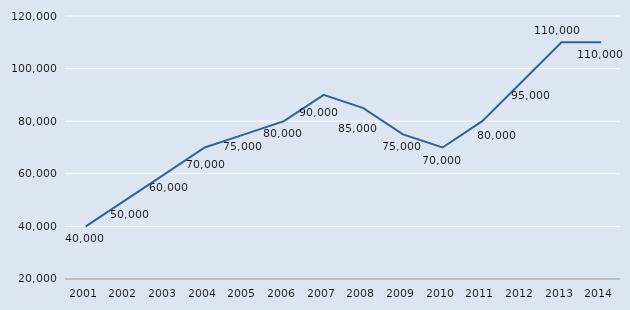
| Category | Series 1 |
|---|---|
| 2001.0 | 40000 |
| 2002.0 | 50000 |
| 2003.0 | 60000 |
| 2004.0 | 70000 |
| 2005.0 | 75000 |
| 2006.0 | 80000 |
| 2007.0 | 90000 |
| 2008.0 | 85000 |
| 2009.0 | 75000 |
| 2010.0 | 70000 |
| 2011.0 | 80000 |
| 2012.0 | 95000 |
| 2013.0 | 110000 |
| 2014.0 | 110000 |